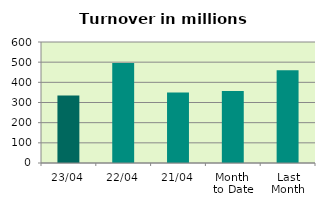
| Category | Series 0 |
|---|---|
| 23/04 | 334.735 |
| 22/04 | 495.848 |
| 21/04 | 349.036 |
| Month 
to Date | 356.852 |
| Last
Month | 459.546 |